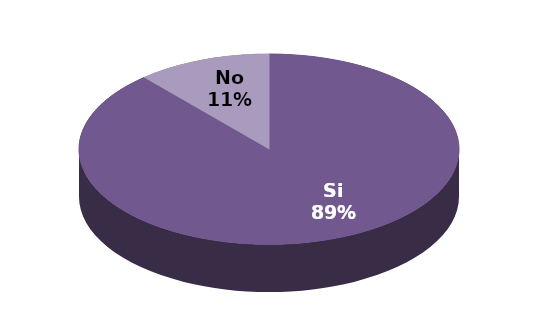
| Category | Series 1 |
|---|---|
| Si | 31 |
| No | 4 |